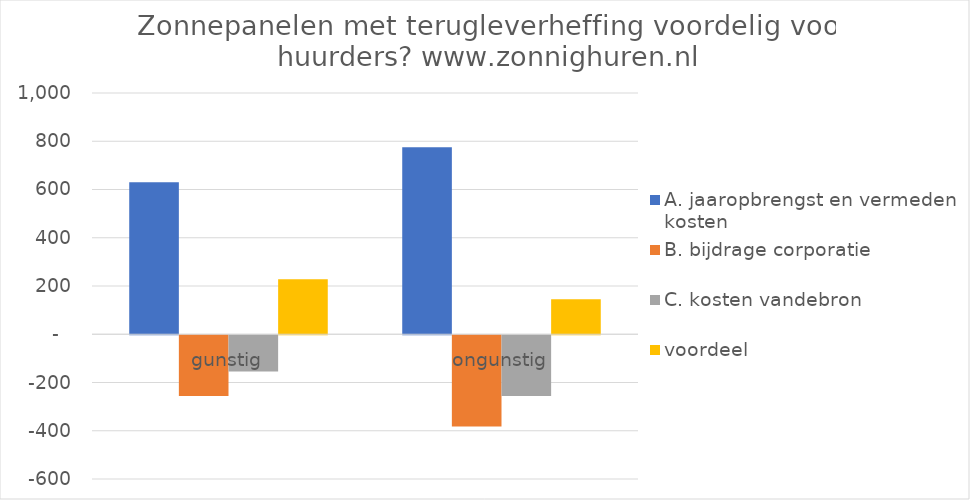
| Category | A. jaaropbrengst en vermeden kosten | B. bijdrage corporatie | C. kosten vandebron | voordeel  |
|---|---|---|---|---|
| gunstig | 630 | -252 | -150 | 228 |
| ongunstig | 775 | -378 | -252 | 145 |